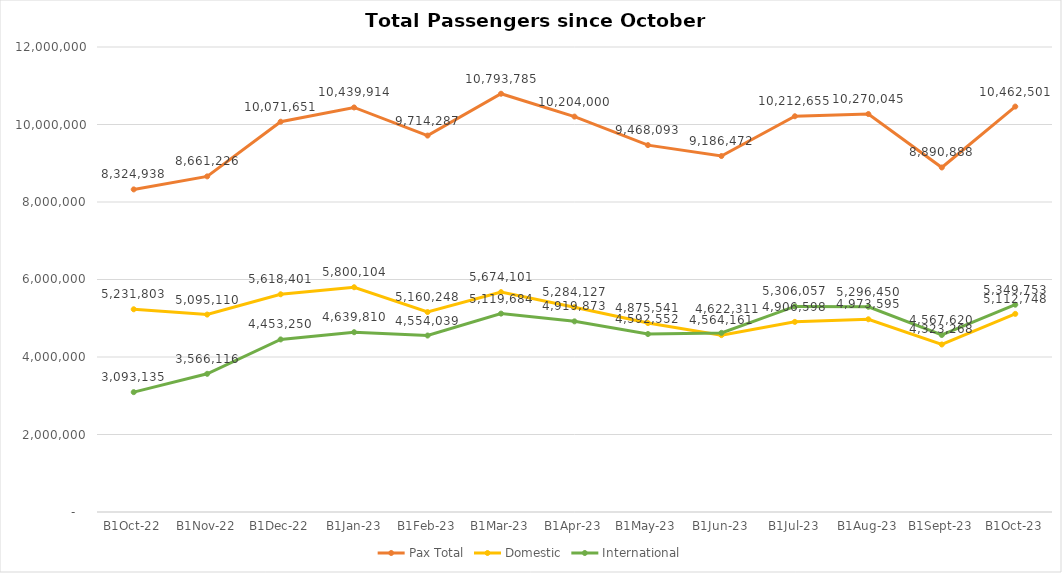
| Category | Pax Total | Domestic | International |
|---|---|---|---|
| 2022-10-01 | 8324938 | 5231803 | 3093135 |
| 2022-11-01 | 8661226 | 5095110 | 3566116 |
| 2022-12-01 | 10071651 | 5618401 | 4453250 |
| 2023-01-01 | 10439914 | 5800104 | 4639810 |
| 2023-02-01 | 9714287 | 5160248 | 4554039 |
| 2023-03-01 | 10793785 | 5674101 | 5119684 |
| 2023-04-01 | 10204000 | 5284127 | 4919873 |
| 2023-05-01 | 9468093 | 4875541 | 4592552 |
| 2023-06-01 | 9186472 | 4564161 | 4622311 |
| 2023-07-01 | 10212655 | 4906598 | 5306057 |
| 2023-08-01 | 10270045 | 4973595 | 5296450 |
| 2023-09-01 | 8890888 | 4323268 | 4567620 |
| 2023-10-01 | 10462501 | 5112748 | 5349753 |